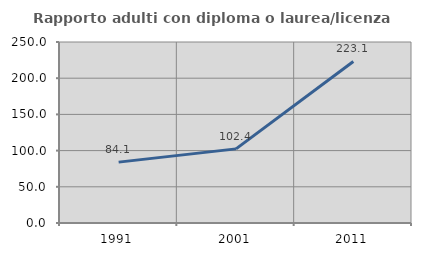
| Category | Rapporto adulti con diploma o laurea/licenza media  |
|---|---|
| 1991.0 | 84.091 |
| 2001.0 | 102.381 |
| 2011.0 | 223.077 |